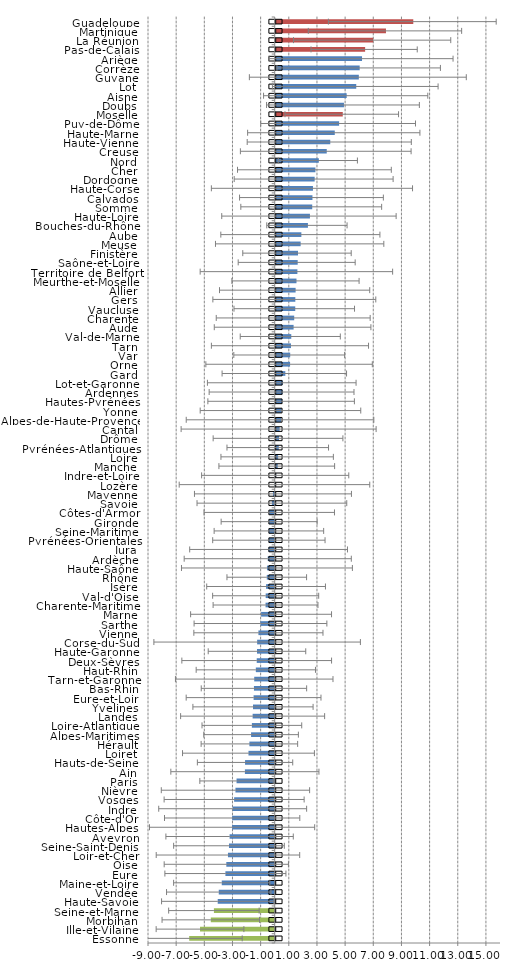
| Category | Series 0 | IC nation | IC nation 2 |
|---|---|---|---|
| Essonne | -6.075 | 0.45 | -0.45 |
| Ille-et-Vilaine | -5.305 | 0.45 | -0.45 |
| Morbihan | -4.541 | 0.45 | -0.45 |
| Seine-et-Marne | -4.319 | 0.45 | -0.45 |
| Haute-Savoie | -4.048 | 0.45 | -0.45 |
| Vendée | -3.975 | 0.45 | -0.45 |
| Maine-et-Loire | -3.762 | 0.45 | -0.45 |
| Eure | -3.503 | 0.45 | -0.45 |
| Oise | -3.438 | 0.45 | -0.45 |
| Loir-et-Cher | -3.321 | 0.45 | -0.45 |
| Seine-Saint-Denis | -3.248 | 0.45 | -0.45 |
| Aveyron | -3.206 | 0.45 | -0.45 |
| Hautes-Alpes | -3.028 | 0.45 | -0.45 |
| Côte-d'Or | -3.023 | 0.45 | -0.45 |
| Indre | -2.986 | 0.45 | -0.45 |
| Vosges | -2.883 | 0.45 | -0.45 |
| Nièvre | -2.789 | 0.45 | -0.45 |
| Paris | -2.711 | 0.45 | -0.45 |
| Ain | -2.118 | 0.45 | -0.45 |
| Hauts-de-Seine | -2.108 | 0.45 | -0.45 |
| Loiret | -1.864 | 0.45 | -0.45 |
| Hérault | -1.8 | 0.45 | -0.45 |
| Alpes-Maritimes | -1.68 | 0.45 | -0.45 |
| Loire-Atlantique | -1.623 | 0.45 | -0.45 |
| Landes | -1.569 | 0.45 | -0.45 |
| Yvelines | -1.543 | 0.45 | -0.45 |
| Eure-et-Loir | -1.501 | 0.45 | -0.45 |
| Bas-Rhin | -1.476 | 0.45 | -0.45 |
| Tarn-et-Garonne | -1.456 | 0.45 | -0.45 |
| Haut-Rhin | -1.343 | 0.45 | -0.45 |
| Deux-Sèvres | -1.279 | 0.45 | -0.45 |
| Haute-Garonne | -1.26 | 0.45 | -0.45 |
| Corse-du-Sud | -1.249 | 0.45 | -0.45 |
| Vienne | -1.159 | 0.45 | -0.45 |
| Sarthe | -1.012 | 0.45 | -0.45 |
| Marne | -0.969 | 0.45 | -0.45 |
| Charente-Maritime | -0.653 | 0.45 | -0.45 |
| Val-d'Oise | -0.643 | 0.45 | -0.45 |
| Isère | -0.613 | 0.45 | -0.45 |
| Rhône | -0.565 | 0.45 | -0.45 |
| Haute-Saône | -0.552 | 0.45 | -0.45 |
| Ardèche | -0.496 | 0.45 | -0.45 |
| Jura | -0.436 | 0.45 | -0.45 |
| Pyrénées-Orientales | -0.415 | 0.45 | -0.45 |
| Seine-Maritime | -0.413 | 0.45 | -0.45 |
| Gironde | -0.397 | 0.45 | -0.45 |
| Côtes-d'Armor | -0.389 | 0.45 | -0.45 |
| Savoie | -0.201 | 0.45 | -0.45 |
| Mayenne | -0.125 | 0.45 | -0.45 |
| Lozère | -0.017 | 0.45 | -0.45 |
| Indre-et-Loire | 0.034 | 0.45 | -0.45 |
| Manche | 0.145 | 0.45 | -0.45 |
| Loire | 0.173 | 0.45 | -0.45 |
| Pyrénées-Atlantiques | 0.216 | 0.45 | -0.45 |
| Drôme | 0.234 | 0.45 | -0.45 |
| Cantal | 0.277 | 0.45 | -0.45 |
| Alpes-de-Haute-Provence | 0.377 | 0.45 | -0.45 |
| Yonne | 0.409 | 0.45 | -0.45 |
| Hautes-Pyrénées | 0.455 | 0.45 | -0.45 |
| Ardennes | 0.487 | 0.45 | -0.45 |
| Lot-et-Garonne | 0.499 | 0.45 | -0.45 |
| Gard | 0.682 | 0.45 | -0.45 |
| Orne | 1.02 | 0.45 | -0.45 |
| Var | 1.029 | 0.45 | -0.45 |
| Tarn | 1.083 | 0.45 | -0.45 |
| Val-de-Marne | 1.105 | 0.45 | -0.45 |
| Aude | 1.269 | 0.45 | -0.45 |
| Charente | 1.313 | 0.45 | -0.45 |
| Vaucluse | 1.387 | 0.45 | -0.45 |
| Gers | 1.393 | 0.45 | -0.45 |
| Allier | 1.413 | 0.45 | -0.45 |
| Meurthe-et-Moselle | 1.475 | 0.45 | -0.45 |
| Territoire de Belfort | 1.54 | 0.45 | -0.45 |
| Saône-et-Loire | 1.561 | 0.45 | -0.45 |
| Finistère | 1.582 | 0.45 | -0.45 |
| Meuse | 1.771 | 0.45 | -0.45 |
| Aube | 1.822 | 0.45 | -0.45 |
| Bouches-du-Rhône | 2.287 | 0.45 | -0.45 |
| Haute-Loire | 2.43 | 0.45 | -0.45 |
| Somme | 2.593 | 0.45 | -0.45 |
| Calvados | 2.609 | 0.45 | -0.45 |
| Haute-Corse | 2.645 | 0.45 | -0.45 |
| Dordogne | 2.765 | 0.45 | -0.45 |
| Cher | 2.819 | 0.45 | -0.45 |
| Nord | 3.062 | 0.45 | -0.45 |
| Creuse | 3.624 | 0.45 | -0.45 |
| Haute-Vienne | 3.873 | 0.45 | -0.45 |
| Haute-Marne | 4.194 | 0.45 | -0.45 |
| Puy-de-Dôme | 4.503 | 0.45 | -0.45 |
| Moselle | 4.762 | 0.45 | -0.45 |
| Doubs | 4.847 | 0.45 | -0.45 |
| Aisne | 5.04 | 0.45 | -0.45 |
| Lot | 5.719 | 0.45 | -0.45 |
| Guyane | 5.903 | 0.45 | -0.45 |
| Corrèze | 5.964 | 0.45 | -0.45 |
| Ariège | 6.13 | 0.45 | -0.45 |
| Pas-de-Calais | 6.35 | 0.45 | -0.45 |
| La Réunion | 6.919 | 0.45 | -0.45 |
| Martinique | 7.83 | 0.45 | -0.45 |
| Guadeloupe | 9.77 | 0.45 | -0.45 |